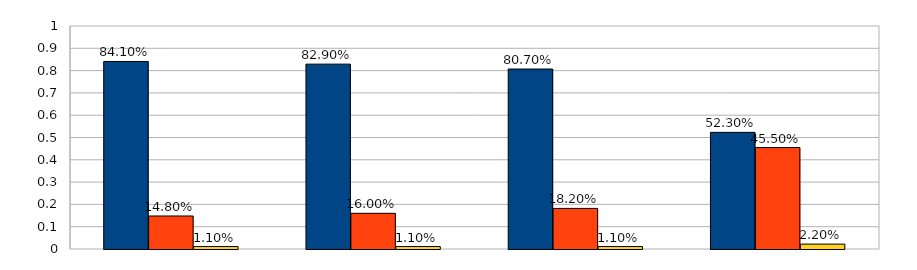
| Category | Хорошо | Удовлетворительно | Неудовлетворительно |
|---|---|---|---|
| 0 | 0.841 | 0.148 | 0.011 |
| 1 | 0.829 | 0.16 | 0.011 |
| 2 | 0.807 | 0.182 | 0.011 |
| 3 | 0.523 | 0.455 | 0.022 |